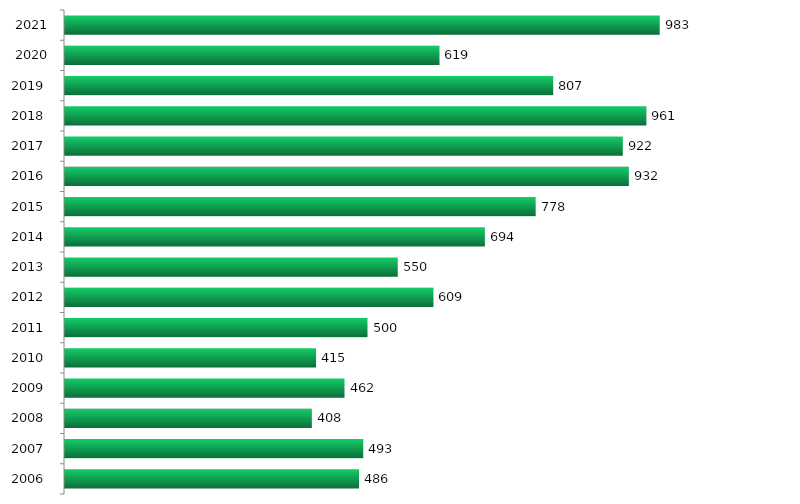
| Category | Series 0 |
|---|---|
| 2006.0 | 486 |
| 2007.0 | 493 |
| 2008.0 | 408 |
| 2009.0 | 462 |
| 2010.0 | 415 |
| 2011.0 | 500 |
| 2012.0 | 609 |
| 2013.0 | 550 |
| 2014.0 | 694 |
| 2015.0 | 778 |
| 2016.0 | 932 |
| 2017.0 | 922 |
| 2018.0 | 961 |
| 2019.0 | 807 |
| 2020.0 | 619 |
| 2021.0 | 983 |